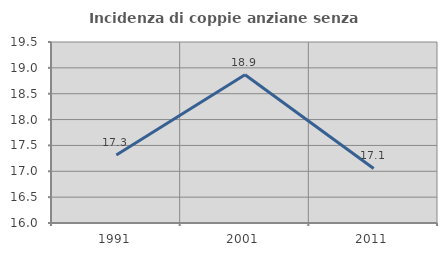
| Category | Incidenza di coppie anziane senza figli  |
|---|---|
| 1991.0 | 17.313 |
| 2001.0 | 18.865 |
| 2011.0 | 17.055 |